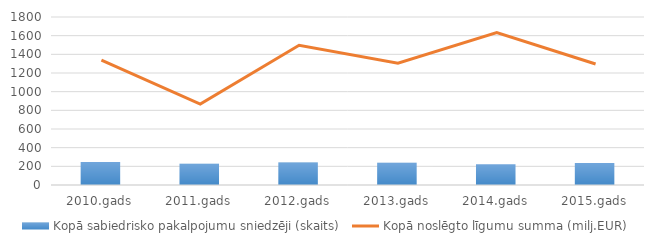
| Category | Kopā sabiedrisko pakalpojumu sniedzēji (skaits) |
|---|---|
| 2010.gads | 247 |
| 2011.gads | 228 |
| 2012.gads | 240 |
| 2013.gads | 238 |
| 2014.gads | 221 |
| 2015.gads | 235 |